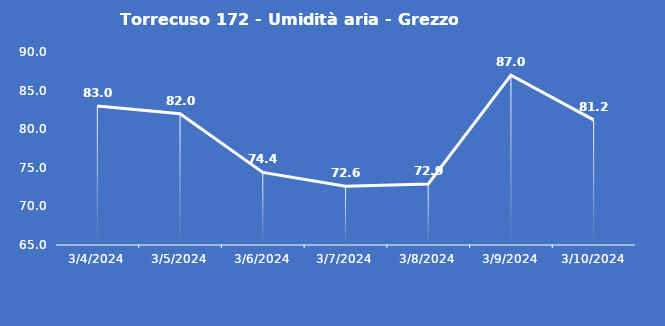
| Category | Torrecuso 172 - Umidità aria - Grezzo (%) |
|---|---|
| 3/4/24 | 83 |
| 3/5/24 | 82 |
| 3/6/24 | 74.4 |
| 3/7/24 | 72.6 |
| 3/8/24 | 72.9 |
| 3/9/24 | 87 |
| 3/10/24 | 81.2 |